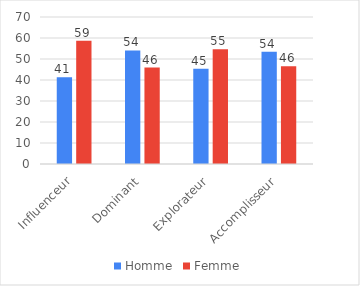
| Category | Homme | Femme |
|---|---|---|
| Influenceur | 41.351 | 58.649 |
| Dominant | 54.07 | 45.93 |
| Explorateur | 45.392 | 54.608 |
| Accomplisseur | 53.506 | 46.494 |